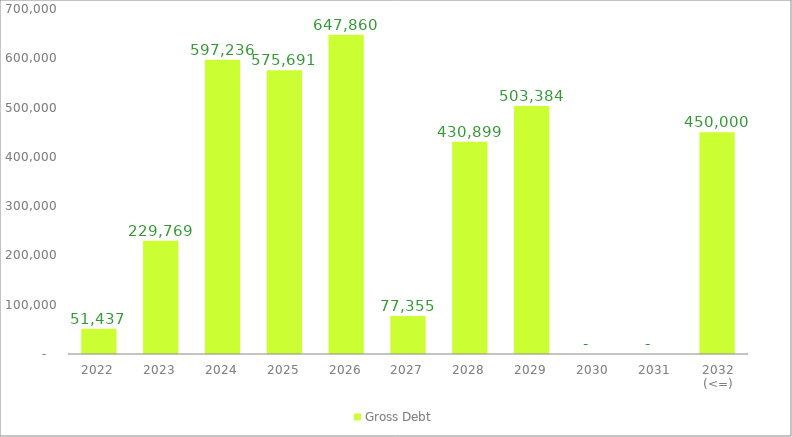
| Category | Gross Debt |
|---|---|
| 2022 | 51436.675 |
| 2023 | 229768.671 |
| 2024 | 597235.604 |
| 2025 | 575690.921 |
| 2026 | 647859.688 |
| 2027 | 77354.957 |
| 2028 | 430899.316 |
| 2029 | 503384.35 |
| 2030 | 0 |
| 2031 | 0 |
| 2032 (<=) | 450000 |